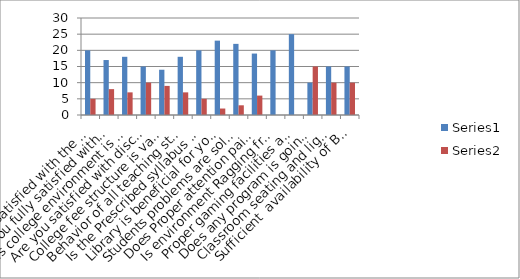
| Category | Series 0 | Series 1 |
|---|---|---|
| Are you satisfied with the teaching course work | 20 | 5 |
| Are you fully satisfied with extracurricular Activities | 17 | 8 |
| Is college environment is good | 18 | 7 |
| Are you satisfied with discipline system of college | 15 | 10 |
| College fee structure is valid in your opinion | 14 | 9 |
| Behavior of all teaching staff  is fully cooperative | 18 | 7 |
| Is the Prescribed syllabus taught by in systematic manner | 20 | 5 |
| Library is beneficial for your ward | 23 | 2 |
| Students problems are solved by teachers during teaching /training session | 22 | 3 |
| Does Proper attention paid by the staff on overall development of Student | 19 | 6 |
| Is environment Ragging free or not | 20 | 0 |
| Proper gaming facilities and play ground is available or not | 25 | 0 |
| Does any program is going on for self dependency purpose of students. | 10 | 15 |
| Classroom seating and lighting facilities’ is sufficient. | 15 | 10 |
| Sufficient  availability of Basic amenities  | 15 | 10 |